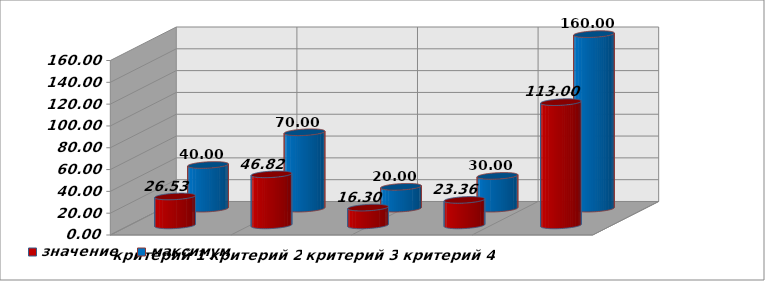
| Category | значение | максимум |
|---|---|---|
| критерий 1 | 26.53 | 40 |
| критерий 2 | 46.817 | 70 |
| критерий 3 | 16.296 | 20 |
| критерий 4 | 23.357 | 30 |